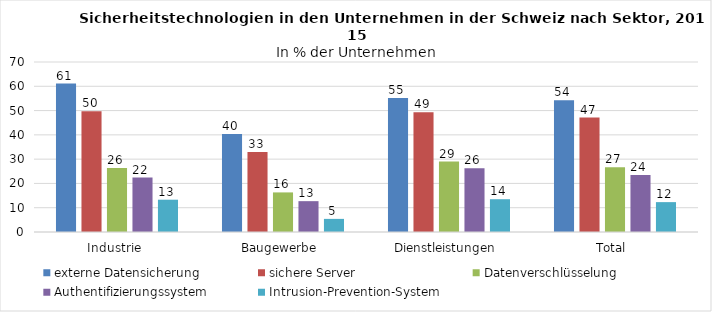
| Category | externe Datensicherung | sichere Server | Datenverschlüsselung | Authentifizierungssystem | Intrusion-Prevention-System |
|---|---|---|---|---|---|
| Industrie  | 61.1 | 49.7 | 26.4 | 22.4 | 13.3 |
| Baugewerbe  | 40.4 | 32.9 | 16.3 | 12.7 | 5.4 |
| Dienstleistungen  | 55.2 | 49.3 | 29 | 26.2 | 13.5 |
| Total  | 54.2 | 47.1 | 26.7 | 23.5 | 12.3 |